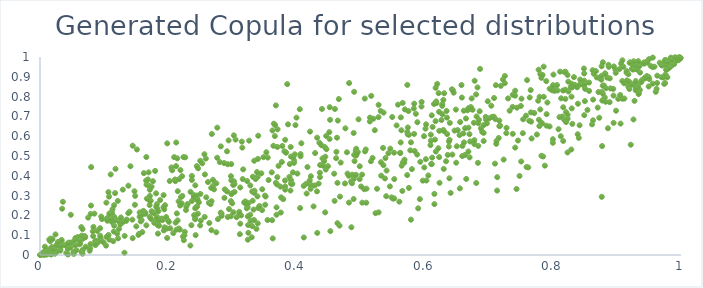
| Category | Copula quantile for var #3 |
|---|---|
| 0.38261258183047175 | 0.346 |
| 0.20927399676293135 | 0.494 |
| 0.44643739564344287 | 0.601 |
| 0.1846586661413312 | 0.221 |
| 0.16548658115789291 | 0.376 |
| 0.3107351618818939 | 0.203 |
| 0.6393377017229795 | 0.667 |
| 0.2361810584552586 | 0.15 |
| 0.545821844600141 | 0.346 |
| 0.16831578314304355 | 0.382 |
| 0.8564769621007144 | 0.871 |
| 0.39175980910658836 | 0.36 |
| 0.4870722694322467 | 0.406 |
| 0.033629300538450486 | 0.071 |
| 0.11308868788182733 | 0.231 |
| 0.6292248810641468 | 0.783 |
| 0.5024897595867515 | 0.406 |
| 0.25936706084758043 | 0.291 |
| 0.3680018223822117 | 0.364 |
| 0.6630054363049567 | 0.505 |
| 0.3023788509890437 | 0.604 |
| 0.8860631757415831 | 0.64 |
| 0.7372974273748696 | 0.748 |
| 0.36791352834552526 | 0.756 |
| 0.13208370562642813 | 0.097 |
| 0.5863343961536884 | 0.713 |
| 0.07746370509266852 | 0.022 |
| 0.20112260663881895 | 0.167 |
| 0.09444815013557673 | 0.086 |
| 0.11680924287065862 | 0.184 |
| 0.012859774287790058 | 0.021 |
| 0.05063269240781667 | 0.064 |
| 0.9959382987581193 | 0.995 |
| 0.4900527880527079 | 0.824 |
| 0.7434254884719849 | 0.334 |
| 0.9756632237695158 | 0.974 |
| 0.9831140842288733 | 0.978 |
| 0.5027911285869777 | 0.264 |
| 0.18292290810495618 | 0.236 |
| 0.9234583666548133 | 0.861 |
| 0.7950022448785603 | 0.649 |
| 0.6174586955457926 | 0.523 |
| 0.08803197974339125 | 0.071 |
| 0.033406651113182285 | 0.048 |
| 0.7661650045774877 | 0.674 |
| 0.10676600411534312 | 0.317 |
| 0.9365387251600623 | 0.962 |
| 0.9339401442557573 | 0.813 |
| 0.6734331520274282 | 0.791 |
| 0.05508613400161268 | 0.05 |
| 0.36271052714437246 | 0.629 |
| 0.9931169706396759 | 0.992 |
| 0.9961747727356851 | 0.989 |
| 0.9727044850587845 | 0.896 |
| 0.4986688229255378 | 0.383 |
| 0.8288520481437445 | 0.533 |
| 0.016027342062443484 | 0.069 |
| 0.39645621506497264 | 0.477 |
| 0.5522974287159741 | 0.517 |
| 0.8124474477954209 | 0.6 |
| 0.3824154953472316 | 0.33 |
| 0.2882801494561136 | 0.332 |
| 0.014414377044886358 | 0.011 |
| 0.2050275332294405 | 0.442 |
| 0.17558164149522779 | 0.215 |
| 0.766900219488889 | 0.588 |
| 0.6152754360809922 | 0.309 |
| 0.4896828830242157 | 0.385 |
| 0.27504414040595293 | 0.362 |
| 0.2819803822785616 | 0.214 |
| 0.22773186676204202 | 0.227 |
| 0.3025869634002447 | 0.372 |
| 0.0185308875516057 | 0.04 |
| 0.5729463556781411 | 0.621 |
| 0.9826940489001572 | 0.96 |
| 0.24988189293071628 | 0.15 |
| 0.49285704316571355 | 0.405 |
| 0.622894961386919 | 0.627 |
| 0.8229810558259487 | 0.518 |
| 0.0553287793882191 | 0.086 |
| 0.42255590949207544 | 0.398 |
| 0.33107537776231766 | 0.321 |
| 0.22209633607417342 | 0.298 |
| 0.4057623306289315 | 0.237 |
| 0.7537649567238986 | 0.686 |
| 0.6453548311255872 | 0.82 |
| 0.8378998059779406 | 0.847 |
| 0.2877310332842171 | 0.289 |
| 0.9258410395123065 | 0.685 |
| 0.5619270256720483 | 0.515 |
| 0.2141124703921378 | 0.488 |
| 0.3148028035648167 | 0.573 |
| 0.6776298778131604 | 0.56 |
| 0.8162095774896443 | 0.576 |
| 0.6776816113851964 | 0.58 |
| 0.1732657621614635 | 0.183 |
| 0.34046574868261814 | 0.602 |
| 0.26808542851358647 | 0.611 |
| 0.8278503818437457 | 0.848 |
| 0.3566402019932866 | 0.379 |
| 0.3302997564896941 | 0.089 |
| 0.6378339915536344 | 0.548 |
| 0.4632973070256412 | 0.592 |
| 0.38695489801466465 | 0.66 |
| 0.5777143840678036 | 0.529 |
| 0.848908974789083 | 0.854 |
| 0.7778444122523069 | 0.936 |
| 0.9746473552659154 | 0.984 |
| 0.5627360753715038 | 0.569 |
| 0.1856312355957925 | 0.148 |
| 0.7897871830500662 | 0.878 |
| 0.5801977198570967 | 0.434 |
| 0.3342365715652704 | 0.476 |
| 0.16589442733675233 | 0.495 |
| 0.225835676304996 | 0.117 |
| 0.5167138851247728 | 0.804 |
| 0.3721497068181634 | 0.45 |
| 0.1928135976195335 | 0.302 |
| 0.16944168880581859 | 0.417 |
| 0.7506924639455974 | 0.472 |
| 0.2466706330887974 | 0.438 |
| 0.19679262954741714 | 0.192 |
| 0.27644150890409946 | 0.491 |
| 0.6298575070686638 | 0.435 |
| 0.46007770393043756 | 0.738 |
| 0.7821710188873112 | 0.895 |
| 0.6147234928794205 | 0.763 |
| 0.20312059577554464 | 0.135 |
| 0.27147397119551897 | 0.332 |
| 0.41725810058414936 | 0.444 |
| 0.9180739144794643 | 0.849 |
| 0.1344895903021097 | 0.172 |
| 0.8796447017230093 | 0.856 |
| 0.6233123885467649 | 0.365 |
| 0.8779065744020045 | 0.855 |
| 0.6277701314538717 | 0.711 |
| 0.9976489446125925 | 0.999 |
| 0.528129574842751 | 0.696 |
| 0.8304277257993817 | 0.662 |
| 0.9328419570811093 | 0.843 |
| 0.020360525231808417 | 0.022 |
| 0.8299605790525675 | 0.847 |
| 0.007668004371225846 | 0.042 |
| 0.40648949332535267 | 0.498 |
| 0.13770735682919621 | 0.212 |
| 0.6103533850982785 | 0.46 |
| 0.15539781516417864 | 0.193 |
| 0.841799205634743 | 0.655 |
| 0.10511299595236774 | 0.173 |
| 0.3772489265538752 | 0.47 |
| 0.09372849809005862 | 0.135 |
| 0.9859263971447945 | 0.958 |
| 0.024164435453712933 | 0.104 |
| 0.638008279260248 | 0.573 |
| 0.024123333860188716 | 0.021 |
| 0.29837219044566154 | 0.459 |
| 0.6645781574770808 | 0.689 |
| 0.3399782767519355 | 0.485 |
| 0.9117076401598752 | 0.79 |
| 0.12043223716318605 | 0.108 |
| 0.686514351516962 | 0.94 |
| 0.39367404906079173 | 0.359 |
| 0.4640446142293513 | 0.161 |
| 0.47883932292461395 | 0.519 |
| 0.3890916691161692 | 0.395 |
| 0.7822416475974023 | 0.501 |
| 0.990347757935524 | 0.975 |
| 0.4822269934229553 | 0.869 |
| 0.6343361181207001 | 0.727 |
| 0.4640650958754122 | 0.364 |
| 0.23042435571551323 | 0.258 |
| 0.7981163123622537 | 0.838 |
| 0.5161660262383521 | 0.474 |
| 0.24214349873363966 | 0.186 |
| 0.5057502980343997 | 0.333 |
| 0.6227353382855654 | 0.495 |
| 0.6711248881183565 | 0.738 |
| 0.2404470313340426 | 0.201 |
| 0.6263245586305857 | 0.682 |
| 0.9065597583539784 | 0.967 |
| 0.18114512879401445 | 0.311 |
| 0.03164099529385566 | 0.029 |
| 0.4212717106565833 | 0.623 |
| 0.6921691205352545 | 0.576 |
| 0.578769694082439 | 0.569 |
| 0.21802810113877058 | 0.128 |
| 0.15115791605785492 | 0.533 |
| 0.3985653086565435 | 0.656 |
| 0.8942696801386774 | 0.839 |
| 0.27657310105860233 | 0.643 |
| 0.9842808805406094 | 0.997 |
| 0.21857791300863028 | 0.25 |
| 0.24228931590914726 | 0.352 |
| 0.8231312157586217 | 0.709 |
| 0.8147550225257874 | 0.699 |
| 0.2428225250914693 | 0.1 |
| 0.744029896799475 | 0.744 |
| 0.27765452675521374 | 0.181 |
| 0.24785224348306656 | 0.266 |
| 0.6406030296348035 | 0.314 |
| 0.9955416885204613 | 0.984 |
| 0.06639025826007128 | 0.13 |
| 0.8700745152309537 | 0.745 |
| 0.919921176508069 | 0.97 |
| 0.6810552254319191 | 0.7 |
| 0.6013771989382803 | 0.638 |
| 0.6097253123298287 | 0.608 |
| 0.31376626808196306 | 0.2 |
| 0.4620116795413196 | 0.489 |
| 0.1712648896500468 | 0.192 |
| 0.13970278250053525 | 0.219 |
| 0.4151844484731555 | 0.36 |
| 0.19318226957693696 | 0.124 |
| 0.8771835654042661 | 0.78 |
| 0.7640059688128531 | 0.796 |
| 0.05877576116472484 | 0.091 |
| 0.0480309962294996 | 0.203 |
| 0.10766734974458816 | 0.295 |
| 0.9751876713708043 | 0.868 |
| 0.8815289069898427 | 0.917 |
| 0.8849339969456196 | 0.896 |
| 0.5483244624920189 | 0.291 |
| 0.2455039382912219 | 0.278 |
| 0.31563775846734643 | 0.542 |
| 0.6058055302128196 | 0.402 |
| 0.6028260560706258 | 0.376 |
| 0.6899707061238587 | 0.621 |
| 0.2929901881143451 | 0.459 |
| 0.16619770321995023 | 0.355 |
| 0.32420360390096903 | 0.077 |
| 0.9262783192098141 | 0.939 |
| 0.6152879376895726 | 0.257 |
| 0.2977540381252765 | 0.196 |
| 0.6502377078868449 | 0.549 |
| 0.8490848853252828 | 0.88 |
| 0.4492280734702945 | 0.449 |
| 0.6649222942069173 | 0.384 |
| 0.9555144202895463 | 0.949 |
| 0.5082469522021711 | 0.533 |
| 0.5381966466084123 | 0.387 |
| 0.6487819510512054 | 0.734 |
| 0.9892472862266004 | 0.964 |
| 0.5234774234704673 | 0.211 |
| 0.7582208849489689 | 0.704 |
| 0.21226152032613754 | 0.449 |
| 0.4901734543964267 | 0.506 |
| 0.23692734213545918 | 0.379 |
| 0.8763983668759465 | 0.294 |
| 0.1480566463433206 | 0.254 |
| 0.2115067900158465 | 0.164 |
| 0.2641407176852226 | 0.162 |
| 0.4115535747259855 | 0.089 |
| 0.7832756554707885 | 0.665 |
| 0.6611106493510306 | 0.729 |
| 0.08996954886242749 | 0.062 |
| 0.21054257359355685 | 0.381 |
| 0.0829554321244359 | 0.096 |
| 0.04683025926351545 | 0.063 |
| 0.60972322197631 | 0.577 |
| 0.18402097793295977 | 0.108 |
| 0.3346352558583021 | 0.324 |
| 0.25315264193341136 | 0.463 |
| 0.5406909268349409 | 0.427 |
| 0.7133560082875192 | 0.393 |
| 0.12177700828760861 | 0.084 |
| 0.6214498891495168 | 0.539 |
| 0.5738193336874247 | 0.644 |
| 0.24395434698089963 | 0.3 |
| 0.2918062726967037 | 0.321 |
| 0.8728498416021466 | 0.893 |
| 0.6631797105073929 | 0.641 |
| 0.1254539098590612 | 0.154 |
| 0.16958590783178804 | 0.351 |
| 0.08491179253906014 | 0.209 |
| 0.9382028616964817 | 0.874 |
| 0.33765897573903203 | 0.132 |
| 0.9263906921260059 | 0.974 |
| 0.9113259543664753 | 0.867 |
| 0.5652504446916282 | 0.324 |
| 0.3641140116378665 | 0.551 |
| 0.7655290490947664 | 0.833 |
| 0.9780826116912067 | 0.953 |
| 0.8427148410119116 | 0.886 |
| 0.24633689038455486 | 0.209 |
| 0.90835638390854 | 0.789 |
| 0.2929828576743603 | 0.192 |
| 0.4624472134746611 | 0.521 |
| 0.07520547881722452 | 0.189 |
| 0.06700726971030235 | 0.027 |
| 0.09672428760677575 | 0.182 |
| 0.91859200457111 | 0.855 |
| 0.6351800886914134 | 0.611 |
| 0.9150840248912573 | 0.921 |
| 0.5257788542658091 | 0.335 |
| 0.019507542718201872 | 0.081 |
| 0.5314875566400588 | 0.728 |
| 0.9793627327308059 | 0.956 |
| 0.0055162468925118455 | 0.015 |
| 0.9559835339896381 | 0.997 |
| 0.8498247195966542 | 0.866 |
| 0.4672971307300031 | 0.148 |
| 0.7413226566277444 | 0.83 |
| 0.19382571848109365 | 0.231 |
| 0.8768989453092217 | 0.55 |
| 0.6111424085684121 | 0.705 |
| 0.5883744279854 | 0.507 |
| 0.28328147297725076 | 0.209 |
| 0.9040795229375362 | 0.939 |
| 0.10485851345583794 | 0.187 |
| 0.5747905550524592 | 0.727 |
| 0.08645990956574677 | 0.05 |
| 0.7751782345585525 | 0.609 |
| 0.09930454893037675 | 0.063 |
| 0.5322756711393595 | 0.401 |
| 0.8811364830471575 | 0.796 |
| 0.6985218795016408 | 0.776 |
| 0.8684874633327127 | 0.897 |
| 0.37030591862276196 | 0.546 |
| 0.22533636493608356 | 0.1 |
| 0.4450913593173027 | 0.496 |
| 0.36685883812606335 | 0.656 |
| 0.11509393295273182 | 0.119 |
| 0.13792179804295304 | 0.35 |
| 0.6091747381724417 | 0.555 |
| 0.4347305139526725 | 0.361 |
| 0.7080184300430119 | 0.698 |
| 0.9316557119600475 | 0.936 |
| 0.01500280108302831 | 0.03 |
| 0.8712577233090997 | 0.823 |
| 0.5563344871625304 | 0.654 |
| 0.2112036682665348 | 0.373 |
| 0.3552919505164027 | 0.492 |
| 0.04392418451607229 | 0.048 |
| 0.36152441473677754 | 0.417 |
| 0.16110306978225705 | 0.223 |
| 0.9257133854553103 | 0.958 |
| 0.43655578466132283 | 0.416 |
| 0.22159904241561887 | 0.398 |
| 0.849035563878715 | 0.917 |
| 0.2401682585477829 | 0.293 |
| 0.9357948019169271 | 0.834 |
| 0.267117815092206 | 0.339 |
| 0.6301478683017194 | 0.626 |
| 0.9967277715913951 | 0.995 |
| 0.6923058405518532 | 0.656 |
| 0.411434062756598 | 0.349 |
| 0.323912194930017 | 0.242 |
| 0.8065105360001326 | 0.858 |
| 0.7822199859656394 | 0.668 |
| 0.6118566179648042 | 0.492 |
| 0.39072517678141594 | 0.326 |
| 0.5505553213879466 | 0.285 |
| 0.634863443672657 | 0.694 |
| 0.9261052221991122 | 0.978 |
| 0.11584048811346298 | 0.193 |
| 0.3403816376812756 | 0.237 |
| 0.5925855082459748 | 0.282 |
| 0.5887157977558672 | 0.671 |
| 0.9341237531043589 | 0.819 |
| 0.25002024229615927 | 0.476 |
| 0.9194909688085318 | 0.838 |
| 0.05495774745941164 | 0.078 |
| 0.9500383022241294 | 0.989 |
| 0.1714275567792356 | 0.298 |
| 0.1815933417528868 | 0.179 |
| 0.1838181708008051 | 0.151 |
| 0.9321403014473617 | 0.957 |
| 0.8180654291063547 | 0.924 |
| 0.7178786708973348 | 0.653 |
| 0.9791688462719321 | 0.939 |
| 0.03370873164385556 | 0.077 |
| 0.973776726052165 | 0.864 |
| 0.49336160626262426 | 0.503 |
| 0.11212958116084336 | 0.167 |
| 0.6604359964840114 | 0.614 |
| 0.5683283256366849 | 0.466 |
| 0.9907604116015136 | 0.998 |
| 0.32627591397613287 | 0.578 |
| 0.9300115066580474 | 0.864 |
| 0.7326387232169509 | 0.729 |
| 0.7375714941881597 | 0.612 |
| 0.06528240023180841 | 0.091 |
| 0.37797552393749356 | 0.551 |
| 0.8028001310303807 | 0.829 |
| 0.6702325963415205 | 0.493 |
| 0.08609126601368187 | 0.07 |
| 0.9946281565353274 | 0.992 |
| 0.035719289910048246 | 0.269 |
| 0.6554446686059237 | 0.672 |
| 0.8504465133883059 | 0.839 |
| 0.1124500990845263 | 0.214 |
| 0.4815887943841517 | 0.4 |
| 0.5736609059385955 | 0.61 |
| 0.7990091652609408 | 0.832 |
| 0.7532473220489919 | 0.615 |
| 0.008282853756099929 | 0.004 |
| 0.07037401571869852 | 0.093 |
| 0.4893327406607568 | 0.616 |
| 0.9435205394402146 | 0.895 |
| 0.6172055508941412 | 0.845 |
| 0.9778852513991296 | 0.957 |
| 0.622500276658684 | 0.723 |
| 0.03367494139820337 | 0.047 |
| 0.5953551097773015 | 0.773 |
| 0.1173284184187651 | 0.177 |
| 0.8638385375961661 | 0.916 |
| 0.5844314186833799 | 0.525 |
| 0.7598437364213169 | 0.883 |
| 0.3397249998524785 | 0.16 |
| 0.1535908211953938 | 0.101 |
| 0.5971273956820369 | 0.376 |
| 0.8425777060911059 | 0.863 |
| 0.476435789372772 | 0.64 |
| 0.935053383000195 | 0.954 |
| 0.9317356697283685 | 0.842 |
| 0.6361321397125721 | 0.506 |
| 0.10827529616653922 | 0.077 |
| 0.5201614862307906 | 0.688 |
| 0.47576642129570246 | 0.361 |
| 0.23459518933668733 | 0.048 |
| 0.5686744977720082 | 0.481 |
| 0.8405593615025282 | 0.591 |
| 0.6700078314170241 | 0.61 |
| 0.602327193133533 | 0.66 |
| 0.348650973290205 | 0.494 |
| 0.40774836856871843 | 0.564 |
| 0.17619956610724333 | 0.373 |
| 0.2134995223022997 | 0.21 |
| 0.5786848557181656 | 0.178 |
| 0.06028950680047278 | 0.083 |
| 0.8622253355570138 | 0.933 |
| 0.7118308646604419 | 0.561 |
| 0.9845915581099689 | 0.991 |
| 0.11027298076078296 | 0.407 |
| 0.20619452605023983 | 0.428 |
| 0.06492249295115468 | 0.098 |
| 0.052149884402751916 | 0.015 |
| 0.32417714735493064 | 0.195 |
| 0.975801829714328 | 0.912 |
| 0.34646380646154284 | 0.227 |
| 0.6837377822957933 | 0.551 |
| 0.6171204764395952 | 0.676 |
| 0.5755574852228165 | 0.607 |
| 0.9191008638590574 | 0.876 |
| 0.708375358954072 | 0.793 |
| 0.22826170409098268 | 0.245 |
| 0.08735038992017506 | 0.065 |
| 0.10357206827029586 | 0.264 |
| 0.11419410444796091 | 0.07 |
| 0.44490488339215517 | 0.215 |
| 0.00714393518865108 | 0.001 |
| 0.8762157154269518 | 0.823 |
| 0.6290899366140366 | 0.631 |
| 0.7302353018894792 | 0.791 |
| 0.5831353752873838 | 0.74 |
| 0.1037561181001365 | 0.092 |
| 0.7097869152203202 | 0.461 |
| 0.1047428487800061 | 0.181 |
| 0.7839929331094027 | 0.91 |
| 0.8829957991838455 | 0.842 |
| 0.3309439024887979 | 0.146 |
| 0.3107841848395765 | 0.218 |
| 0.4933403437025845 | 0.537 |
| 0.49070965265855193 | 0.474 |
| 0.17826984869316226 | 0.162 |
| 0.6581187788397074 | 0.795 |
| 0.06542053120210768 | 0.019 |
| 0.5838550277985632 | 0.764 |
| 0.7105221762321889 | 0.686 |
| 0.4001303110271692 | 0.694 |
| 0.6467355913482606 | 0.628 |
| 0.4215910444036126 | 0.357 |
| 0.8541114018298686 | 0.733 |
| 0.6587017383426428 | 0.5 |
| 0.24207948194816709 | 0.181 |
| 0.7189621762372553 | 0.854 |
| 0.34526397474110126 | 0.413 |
| 0.8104610433802009 | 0.697 |
| 0.6879104138351977 | 0.639 |
| 0.5090086944401264 | 0.264 |
| 0.08342235162854195 | 0.142 |
| 0.8295194930396974 | 0.741 |
| 0.36308045592159033 | 0.084 |
| 0.45132905058562756 | 0.621 |
| 0.15955007262527943 | 0.116 |
| 0.8820141707547009 | 0.916 |
| 0.43897414952516556 | 0.554 |
| 0.9765582452528179 | 0.984 |
| 0.31698628747835755 | 0.432 |
| 0.339546543546021 | 0.395 |
| 0.21249584201723334 | 0.568 |
| 0.84261908615008 | 0.861 |
| 0.6334906462579966 | 0.474 |
| 0.06442274432629343 | 0.141 |
| 0.8035901505500078 | 0.838 |
| 0.8230795683339238 | 0.688 |
| 0.19435122795403 | 0.14 |
| 0.8174889837391675 | 0.685 |
| 0.4208004269748926 | 0.377 |
| 0.23491429816931486 | 0.319 |
| 0.2265660623088479 | 0.494 |
| 0.9668834209442139 | 0.971 |
| 0.389690060634166 | 0.459 |
| 0.30512507166713476 | 0.583 |
| 0.8761557280085981 | 0.953 |
| 0.43253573635593057 | 0.112 |
| 0.3837469327263534 | 0.517 |
| 0.9152380903251469 | 0.929 |
| 0.7511456906795502 | 0.79 |
| 0.8948449594900013 | 0.667 |
| 0.06490700459107758 | 0.014 |
| 0.5755159039981663 | 0.339 |
| 0.535172185394913 | 0.541 |
| 0.8947269241325557 | 0.805 |
| 0.49257993418723345 | 0.525 |
| 0.7456656927242875 | 0.578 |
| 0.331782182212919 | 0.274 |
| 0.043601233512163155 | 0.031 |
| 0.043562814127653844 | 0.002 |
| 0.5990689476020634 | 0.6 |
| 0.9085628092288971 | 0.983 |
| 0.6426015780307353 | 0.837 |
| 0.9698033989407122 | 0.96 |
| 0.43213276052847505 | 0.321 |
| 0.4857766516506672 | 0.14 |
| 0.24393914872780442 | 0.243 |
| 0.7709800908342004 | 0.717 |
| 0.7658988302573562 | 0.72 |
| 0.5147691839374602 | 0.694 |
| 0.8672575745731592 | 0.929 |
| 0.692117992322892 | 0.617 |
| 0.898680682759732 | 0.729 |
| 0.9961019176989794 | 0.994 |
| 0.839152293279767 | 0.764 |
| 0.2978263827972114 | 0.272 |
| 0.3466539438813925 | 0.332 |
| 0.6575130498968065 | 0.859 |
| 0.3321296190842986 | 0.395 |
| 0.6181716755963862 | 0.776 |
| 0.1214189254678786 | 0.273 |
| 0.5495052854530513 | 0.697 |
| 0.37613792857155204 | 0.291 |
| 0.7165995864197612 | 0.651 |
| 0.6769392914138734 | 0.668 |
| 0.9705618061125278 | 0.961 |
| 0.17134965024888513 | 0.33 |
| 0.047778497915714986 | 0.038 |
| 0.21680071065202355 | 0.133 |
| 0.3531346865929663 | 0.519 |
| 0.8330160700716078 | 0.898 |
| 0.518858035095036 | 0.491 |
| 0.2985365050844848 | 0.307 |
| 0.20238647190853956 | 0.374 |
| 0.39109186036512256 | 0.546 |
| 0.11716838367283339 | 0.313 |
| 0.9178861482068896 | 0.913 |
| 0.15846935240551835 | 0.176 |
| 0.18735483940690753 | 0.277 |
| 0.8206444829702377 | 0.671 |
| 0.36638628551736474 | 0.601 |
| 0.7165314578451216 | 0.679 |
| 0.5628884024918079 | 0.695 |
| 0.5659464588388801 | 0.468 |
| 0.2565173087641597 | 0.509 |
| 0.3519601230509579 | 0.295 |
| 0.683756175916642 | 0.666 |
| 0.028710025362670425 | 0.048 |
| 0.5464630080386996 | 0.537 |
| 0.5899743451736867 | 0.236 |
| 0.01659878529608249 | 0.005 |
| 0.19850333966314793 | 0.564 |
| 0.8725469023920596 | 0.693 |
| 0.3014006963931024 | 0.353 |
| 0.4220590712502599 | 0.355 |
| 0.3837187485769391 | 0.518 |
| 0.3279202748090029 | 0.203 |
| 0.9293030458502471 | 0.832 |
| 0.8162660589441657 | 0.746 |
| 0.779020763002336 | 0.651 |
| 0.4267754126340151 | 0.246 |
| 0.9435683991760015 | 0.892 |
| 0.8159968019463122 | 0.831 |
| 0.3124611913226545 | 0.158 |
| 0.22299689427018166 | 0.093 |
| 0.2446831907145679 | 0.449 |
| 0.32204738026484847 | 0.256 |
| 0.3706480930559337 | 0.635 |
| 0.4854323221370578 | 0.372 |
| 0.8826410328038037 | 0.774 |
| 0.7251934078522027 | 0.868 |
| 0.4159802566282451 | 0.31 |
| 0.056777519173920196 | 0.025 |
| 0.08761492464691396 | 0.061 |
| 0.269688562490046 | 0.348 |
| 0.4680190901271999 | 0.295 |
| 0.002004449255764486 | 0.004 |
| 0.18436744483187792 | 0.154 |
| 0.7156082233414054 | 0.591 |
| 0.5389805287122726 | 0.49 |
| 0.7481136312708259 | 0.399 |
| 0.26757096080109477 | 0.272 |
| 0.4661680213175714 | 0.788 |
| 0.4529761942103505 | 0.121 |
| 0.26348625402897596 | 0.263 |
| 0.2998768244870007 | 0.312 |
| 0.98246680945158 | 0.976 |
| 0.9204096901230514 | 0.973 |
| 0.30339718144387007 | 0.358 |
| 0.9697498772293329 | 0.898 |
| 0.7903340244665742 | 0.711 |
| 0.44415861275047064 | 0.546 |
| 0.9331286950036883 | 0.855 |
| 0.6953305541537702 | 0.698 |
| 0.21708076074719426 | 0.383 |
| 0.6387264858931303 | 0.387 |
| 0.46460614958778024 | 0.679 |
| 0.12964463606476784 | 0.167 |
| 0.22007823549211022 | 0.293 |
| 0.06178600434213876 | 0.054 |
| 0.42857029056176543 | 0.351 |
| 0.9471883117221296 | 0.972 |
| 0.9231777396053076 | 0.862 |
| 0.8500244077295065 | 0.777 |
| 0.5357671054080129 | 0.454 |
| 0.915469700936228 | 0.882 |
| 0.4457483487203717 | 0.432 |
| 0.3915150761604309 | 0.378 |
| 0.9619454671628773 | 0.839 |
| 0.1087228730320931 | 0.208 |
| 0.5282160337083042 | 0.215 |
| 0.2572445925325155 | 0.407 |
| 0.5435186340473592 | 0.514 |
| 0.8868250460363925 | 0.96 |
| 0.15552398841828108 | 0.215 |
| 0.0787695129401982 | 0.055 |
| 0.7412295849062502 | 0.805 |
| 0.3699578461237252 | 0.356 |
| 0.6683428664691746 | 0.523 |
| 0.48201797995716333 | 0.265 |
| 0.7858160105533898 | 0.799 |
| 0.8756851339712739 | 0.885 |
| 0.8627829495817423 | 0.68 |
| 0.12916022073477507 | 0.33 |
| 0.9294247911311686 | 0.879 |
| 0.37518337508663535 | 0.346 |
| 0.5995617844164371 | 0.442 |
| 0.2673914744518697 | 0.126 |
| 0.3163319546729326 | 0.384 |
| 0.171045265160501 | 0.252 |
| 0.1502559599466622 | 0.145 |
| 0.6590394675731659 | 0.551 |
| 0.9945248416624963 | 0.984 |
| 0.3016407764516771 | 0.216 |
| 0.6517092077992857 | 0.631 |
| 0.938949279487133 | 0.883 |
| 0.6218390702269971 | 0.818 |
| 0.7233355985954404 | 0.482 |
| 0.27500793617218733 | 0.115 |
| 0.12318766536191111 | 0.132 |
| 0.1473692827858031 | 0.322 |
| 0.32809395622462034 | 0.352 |
| 0.013840832281857725 | 0.02 |
| 0.06631632009521128 | 0.007 |
| 0.7794486824423075 | 0.799 |
| 0.15713502233847976 | 0.17 |
| 0.13534992374479773 | 0.179 |
| 0.9275059797801077 | 0.779 |
| 0.14413741091266272 | 0.178 |
| 0.2586870086379349 | 0.487 |
| 0.3975217454135418 | 0.509 |
| 0.007507302798330773 | 0.014 |
| 0.6274902187287807 | 0.753 |
| 0.4867861303500831 | 0.362 |
| 0.17123833624646065 | 0.274 |
| 0.18554321676492688 | 0.175 |
| 0.3123667794279754 | 0.341 |
| 0.30670181894674897 | 0.191 |
| 0.7131451196037233 | 0.325 |
| 0.813024781178683 | 0.791 |
| 0.28329327004030347 | 0.197 |
| 0.6858883122913539 | 0.726 |
| 0.1646519005298614 | 0.208 |
| 0.22109144693240518 | 0.261 |
| 0.0795151642523706 | 0.25 |
| 0.004937049001455314 | 0.009 |
| 0.33922687312588096 | 0.296 |
| 0.32527579087764025 | 0.263 |
| 0.09595965361222625 | 0.072 |
| 0.8229561313055456 | 0.909 |
| 0.46910030487924814 | 0.467 |
| 0.6550149885006249 | 0.337 |
| 0.4323570402339101 | 0.592 |
| 0.00025169597938656807 | 0.001 |
| 0.8874222855083646 | 0.95 |
| 0.1926409723237157 | 0.242 |
| 0.11564285308122633 | 0.149 |
| 0.4468880109488964 | 0.534 |
| 0.18124487530440092 | 0.243 |
| 0.17955372482538223 | 0.425 |
| 0.8485907148569822 | 0.942 |
| 0.025587422773241993 | 0.015 |
| 0.5585123328492045 | 0.759 |
| 0.38129400135949254 | 0.524 |
| 0.4797629611566663 | 0.411 |
| 0.6019695559516549 | 0.484 |
| 0.08240383164957164 | 0.12 |
| 0.6669583669863641 | 0.731 |
| 0.82974146399647 | 0.865 |
| 0.5932883489876986 | 0.471 |
| 0.17403928423300385 | 0.346 |
| 0.025669678114354597 | 0.05 |
| 0.03449924942106009 | 0.234 |
| 0.15450345305725932 | 0.107 |
| 0.11781304795294997 | 0.435 |
| 0.9606339777819812 | 0.824 |
| 0.9526553582400084 | 0.955 |
| 0.016559613402932882 | 0.009 |
| 0.14458655193448072 | 0.085 |
| 0.6684257136657834 | 0.741 |
| 0.04101462522521616 | 0.01 |
| 0.23714194213971496 | 0.273 |
| 0.32261777529492974 | 0.236 |
| 0.28205964621156454 | 0.549 |
| 0.6545395124703646 | 0.606 |
| 0.7112016319297254 | 0.858 |
| 0.99789829691872 | 0.989 |
| 0.07824146188795568 | 0.035 |
| 0.31175702158361673 | 0.105 |
| 0.8198456414975227 | 0.926 |
| 0.5637672254815698 | 0.63 |
| 0.38568272115662694 | 0.863 |
| 0.5066550872288644 | 0.79 |
| 0.2079266598448157 | 0.111 |
| 0.36482131062075496 | 0.663 |
| 0.3232071246020496 | 0.374 |
| 0.9627078953199089 | 0.869 |
| 0.38219501497223973 | 0.376 |
| 0.005478183273226027 | 0.01 |
| 0.6748479213565588 | 0.734 |
| 0.6848080549389124 | 0.683 |
| 0.24210812849923974 | 0.236 |
| 0.06268376158550383 | 0.059 |
| 0.8291963981464505 | 0.8 |
| 0.89770233258605 | 0.937 |
| 0.44072104850783944 | 0.488 |
| 0.5658036177046597 | 0.768 |
| 0.014464185107499368 | 0.077 |
| 0.984127689152956 | 0.989 |
| 0.4969235686585307 | 0.685 |
| 0.9233982264995575 | 0.941 |
| 0.8009985233657062 | 0.911 |
| 0.6721807201392949 | 0.747 |
| 0.7040578629821539 | 0.754 |
| 0.16332634398713708 | 0.217 |
| 0.790270924102515 | 0.653 |
| 0.3621133379638195 | 0.176 |
| 0.2146846861578524 | 0.175 |
| 0.039170351345092044 | 0.049 |
| 0.5093897138722241 | 0.335 |
| 0.11066834162920712 | 0.184 |
| 0.2149400389753282 | 0.322 |
| 0.21624434692785144 | 0.271 |
| 0.8760158969089389 | 0.905 |
| 0.7631729799322784 | 0.678 |
| 0.6197244902141392 | 0.864 |
| 0.9101277804002166 | 0.951 |
| 0.3550089569762349 | 0.177 |
| 0.9470775411464274 | 0.978 |
| 0.12214910518378022 | 0.172 |
| 0.7804663684219122 | 0.735 |
| 0.14111436344683165 | 0.448 |
| 0.22383832931518557 | 0.495 |
| 0.13178913434967396 | 0.011 |
| 0.436796004883945 | 0.394 |
| 0.7616925202310085 | 0.442 |
| 0.8242172743193805 | 0.876 |
| 0.35099585773423314 | 0.3 |
| 0.9216066119261086 | 0.557 |
| 0.1484721004962921 | 0.298 |
| 0.9051154162734747 | 0.808 |
| 0.5836114040575922 | 0.611 |
| 0.9361790274269879 | 0.921 |
| 0.4431974566541612 | 0.474 |
| 0.6184460334479809 | 0.767 |
| 0.643283924087882 | 0.507 |
| 0.924584096763283 | 0.939 |
| 0.291766828391701 | 0.524 |
| 0.6971924533136189 | 0.665 |
| 0.9504515030421317 | 0.889 |
| 0.5619544978253543 | 0.516 |
| 0.9925305317156017 | 0.996 |
| 0.9854220664128661 | 0.96 |
| 0.6125296810641885 | 0.647 |
| 0.022029725369066014 | 0.029 |
| 0.3794634868390858 | 0.282 |
| 0.4595961421728134 | 0.273 |
| 0.878397551830858 | 0.781 |
| 0.6957251504063606 | 0.685 |
| 0.43991070752963424 | 0.738 |
| 0.7053069234825671 | 0.698 |
| 0.8491007080301642 | 0.706 |
| 0.3962853094562888 | 0.465 |
| 0.9558161594904959 | 0.866 |
| 0.19837909936904907 | 0.086 |
| 0.8899341113865376 | 0.841 |
| 0.6684266198426485 | 0.643 |
| 0.199749210383743 | 0.174 |
| 0.5319280759431422 | 0.469 |
| 0.36898566456511617 | 0.204 |
| 0.9084679391235113 | 0.879 |
| 0.28053315496072173 | 0.469 |
| 0.18227820051833984 | 0.257 |
| 0.2978601190261543 | 0.398 |
| 0.09560200804844499 | 0.194 |
| 0.3702823747880757 | 0.393 |
| 0.9969516834244132 | 0.989 |
| 0.18972185486927629 | 0.184 |
| 0.3953387727960944 | 0.494 |
| 0.33311971463263035 | 0.23 |
| 0.45253952220082283 | 0.683 |
| 0.8074448127299547 | 0.831 |
| 0.6825549062341452 | 0.846 |
| 0.12628419557586307 | 0.19 |
| 0.40154856350272894 | 0.411 |
| 0.32849033595994115 | 0.173 |
| 0.945552964694798 | 0.896 |
| 0.7950922730378807 | 0.84 |
| 0.7502058115787804 | 0.753 |
| 0.17408108245581388 | 0.221 |
| 0.06639136001467706 | 0.082 |
| 0.560579068493098 | 0.27 |
| 0.29986184975132346 | 0.261 |
| 0.5730075943283737 | 0.859 |
| 0.010634206235408781 | 0.002 |
| 0.8206768902018666 | 0.721 |
| 0.9586243769153953 | 0.951 |
| 0.6276235561817884 | 0.762 |
| 0.7251777481287718 | 0.904 |
| 0.7783480230718851 | 0.683 |
| 0.2661922383122146 | 0.257 |
| 0.5525464243255556 | 0.286 |
| 0.6803824035450816 | 0.811 |
| 0.13446276215836409 | 0.177 |
| 0.9426494725048542 | 0.966 |
| 0.044113788753747926 | 0.062 |
| 0.07132763648405671 | 0.042 |
| 0.43585314555093646 | 0.567 |
| 0.8388364524580538 | 0.61 |
| 0.19507054053246975 | 0.252 |
| 0.9630307140760124 | 0.906 |
| 0.4415400247089565 | 0.451 |
| 0.8612505658529699 | 0.66 |
| 0.3690408361144364 | 0.241 |
| 0.9333106377162039 | 0.979 |
| 0.6781023941002786 | 0.88 |
| 0.5145768164657056 | 0.674 |
| 0.16032538050785664 | 0.205 |
| 0.9823932629078627 | 0.947 |
| 0.8089861166663468 | 0.635 |
| 0.8196537373587489 | 0.788 |
| 0.6806169906631112 | 0.364 |
| 0.5282382844015956 | 0.758 |
| 0.17258211597800252 | 0.274 |
| 0.2451670505106449 | 0.246 |
| 0.9020827449858189 | 0.788 |
| 0.5223053307272494 | 0.63 |
| 0.9701387011446059 | 0.957 |
| 0.8888883115723729 | 0.892 |
| 0.017434372566640377 | 0.003 |
| 0.06901784706860781 | 0.096 |
| 0.09379870444536212 | 0.097 |
| 0.6710523953661323 | 0.574 |
| 0.737539975438267 | 0.809 |
| 0.8193997829221189 | 0.835 |
| 0.4589187246747315 | 0.411 |
| 0.22440559742972252 | 0.075 |
| 0.05276975547894834 | 0.005 |
| 0.3364105671644211 | 0.384 |
| 0.18810592126101255 | 0.18 |
| 0.7122064591385424 | 0.576 |
| 0.1779067269526422 | 0.212 |
| 0.28721131663769484 | 0.464 |
| 0.3757113507017493 | 0.215 |
| 0.888720883987844 | 0.772 |
| 0.8003659211099148 | 0.858 |
| 0.9468535305932164 | 0.904 |
| 0.6112056141719222 | 0.459 |
| 0.07903828658163546 | 0.208 |
| 0.17211972596123815 | 0.275 |
| 0.507084084674716 | 0.523 |
| 0.6161293215118349 | 0.583 |
| 0.2984648304991424 | 0.377 |
| 0.3513618032447994 | 0.254 |
| 0.7278197472915053 | 0.642 |
| 0.3247210141271353 | 0.151 |
| 0.16593156056478614 | 0.15 |
| 0.250260001514107 | 0.308 |
| 0.4053040314465761 | 0.736 |
| 0.722221212927252 | 0.887 |
| 0.9495023139752448 | 0.899 |
| 0.14461733773350713 | 0.552 |
| 0.1980870589613914 | 0.134 |
| 0.7413272275589406 | 0.543 |
| 0.061727650929242345 | 0.074 |
| 0.9496081392280757 | 0.851 |
| 0.7848083255812526 | 0.498 |
| 0.10299279354512683 | 0.047 |
| 0.7875846428796649 | 0.451 |
| 0.895235144533217 | 0.952 |
| 0.2508751479908824 | 0.174 |
| 0.8113881689496338 | 0.926 |
| 0.8780743586830795 | 0.973 |
| 0.8345602727495134 | 0.859 |
| 0.3824582463130355 | 0.582 |
| 0.49402736127376556 | 0.511 |
| 0.2569240890443325 | 0.192 |
| 0.5526470309123397 | 0.383 |
| 0.18218057742342353 | 0.194 |
| 0.32508452236652374 | 0.112 |
| 0.7771709989756346 | 0.779 |
| 0.394541023299098 | 0.417 |
| 0.07041393360123041 | 0.089 |
| 0.21278954390436405 | 0.128 |
| 0.5728858252987266 | 0.404 |
| 0.9423098149709404 | 0.973 |
| 0.898228841368109 | 0.92 |
| 0.9057285552844405 | 0.664 |
| 0.016410008538514386 | 0.083 |
| 0.19095704471692446 | 0.176 |
| 0.4221383552066982 | 0.334 |
| 0.34232983738183975 | 0.248 |
| 0.7805366921238601 | 0.914 |
| 0.66146967606619 | 0.569 |
| 0.54011515295133 | 0.297 |
| 0.3034835481084883 | 0.319 |
| 0.11556582711637021 | 0.251 |
| 0.48926260182633996 | 0.283 |
| 0.10836982587352392 | 0.21 |
| 0.45204486045986414 | 0.746 |
| 0.23693119268864396 | 0.399 |
| 0.4988049981184304 | 0.448 |
| 0.6439715018495917 | 0.833 |
| 0.24000458186492324 | 0.303 |
| 0.15737125277519223 | 0.205 |
| 0.7857412141747773 | 0.951 |
| 0.3921839250251651 | 0.361 |
| 0.00039189960807561896 | 0 |
| 0.023250253405421962 | 0.006 |
| 0.9967856230214238 | 0.998 |
| 0.3342616409063339 | 0.314 |
| 0.5009448430500925 | 0.346 |
| 0.6493339249864221 | 0.466 |
| 0.9790690555237234 | 0.975 |
| 0.8001323915086687 | 0.585 |
| 0.1667508208192885 | 0.285 |
| 0.6389278755523264 | 0.582 |
| 0.333855370990932 | 0.177 |
| 0.8566559408791363 | 0.829 |
| 0.535958687774837 | 0.719 |
| 0.26982378074899316 | 0.379 |
| 0.0051416154019534605 | 0.001 |
| 0.8781425883062184 | 0.815 |
| 0.7915380881167948 | 0.77 |
| 0.9295273921452463 | 0.847 |
| 0.10692181903868911 | 0.101 |
| 0.436976439319551 | 0.455 |
| 0.569151480216533 | 0.735 |
| 0.03171322308480739 | 0.022 |
| 0.9254506165161729 | 0.937 |
| 0.495780021417886 | 0.52 |
| 0.24558798177167773 | 0.283 |
| 0.39154835464432836 | 0.497 |
| 0.45177828101441264 | 0.586 |
| 0.8000371195375919 | 0.567 |
| 0.33854957204312086 | 0.419 |
| 0.5642430381849408 | 0.451 |
| 0.3185161887668073 | 0.265 |
| 0.4291778071783483 | 0.515 |
| 0.16203828249126678 | 0.413 |
| 0.7590319202281535 | 0.445 |
| 0.2191193928010762 | 0.429 |
| 0.9787831315770745 | 0.898 |
| 0.2620744542218745 | 0.369 |
| 0.0798444990068674 | 0.444 |
| 0.9993014335632324 | 0.995 |
| 0.6832294631749392 | 0.465 |
| 0.8244461617432535 | 0.826 |
| 0.700649312697351 | 0.69 |
| 0.40644196420907974 | 0.51 |
| 0.6305520152673125 | 0.817 |
| 0.8629396157339214 | 0.785 |
| 0.027928981464356177 | 0.066 |
| 0.2948885802179575 | 0.232 |
| 0.3204660564661026 | 0.271 |
| 0.08949830429628496 | 0.122 |
| 0.9991182978264987 | 0.995 |
| 0.9766476326622069 | 0.936 |
| 0.2942345403134823 | 0.579 |
| 0.595133897382766 | 0.75 |
| 0.7274726964533329 | 0.616 |